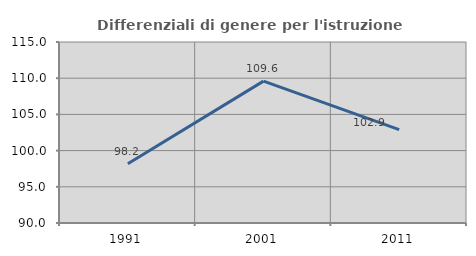
| Category | Differenziali di genere per l'istruzione superiore |
|---|---|
| 1991.0 | 98.19 |
| 2001.0 | 109.595 |
| 2011.0 | 102.886 |